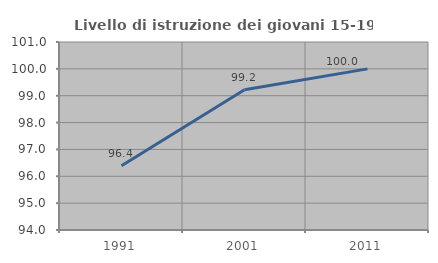
| Category | Livello di istruzione dei giovani 15-19 anni |
|---|---|
| 1991.0 | 96.392 |
| 2001.0 | 99.219 |
| 2011.0 | 100 |